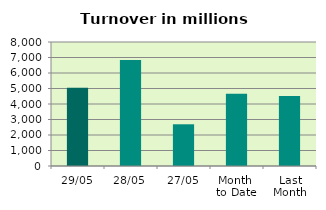
| Category | Series 0 |
|---|---|
| 29/05 | 5042.605 |
| 28/05 | 6841.669 |
| 27/05 | 2691.534 |
| Month 
to Date | 4667.659 |
| Last
Month | 4514.737 |